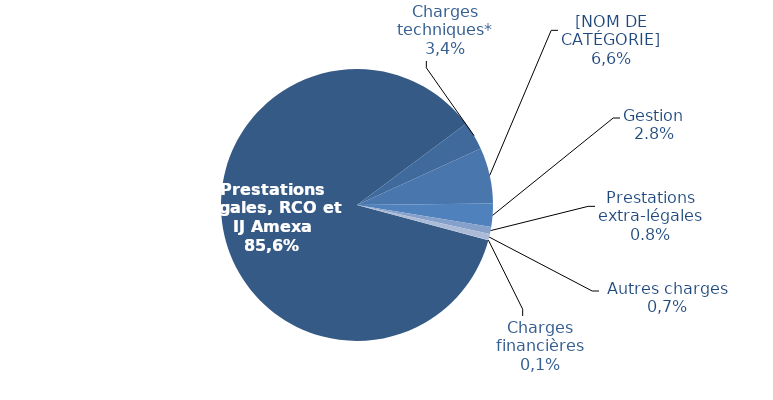
| Category | Series 0 |
|---|---|
| Prestations légales | 13820.51 |
| Charges techniques* | 544.387 |
| Dotations aux provisions | 1073.175 |
| Gestion | 446.729 |
| Prestations extra-légales | 134.912 |
| Autres charges | 114.18 |
| Charges financières | 4.18 |